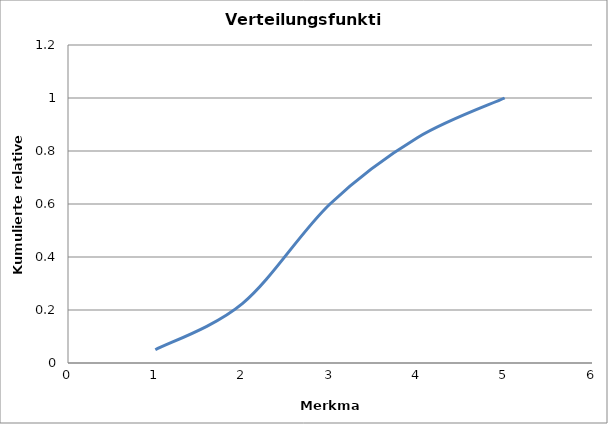
| Category | Series 0 |
|---|---|
| 1.0 | 0.05 |
| 2.0 | 0.225 |
| 3.0 | 0.6 |
| 4.0 | 0.85 |
| 5.0 | 1 |